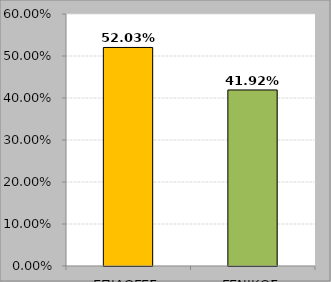
| Category | Series 0 |
|---|---|
| ΕΠΙΛΟΓΕΣ | 0.52 |
| ΓΕΝΙΚΟΣ | 0.419 |